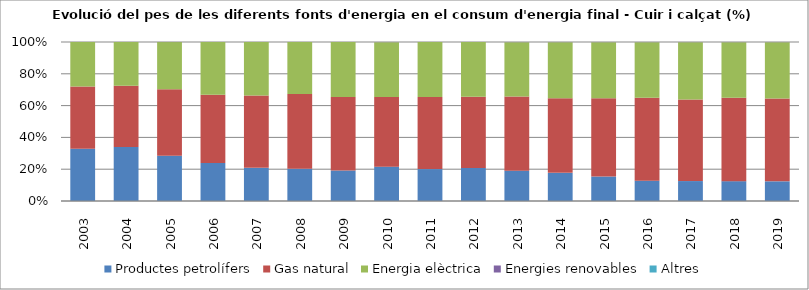
| Category | Productes petrolífers | Gas natural | Energia elèctrica | Energies renovables | Altres |
|---|---|---|---|---|---|
| 2003.0 | 8.65 | 10.31 | 7.36 | 0 | 0 |
| 2004.0 | 8.41 | 9.53 | 6.82 | 0 | 0 |
| 2005.0 | 5.79 | 8.53 | 6.06 | 0.01 | 0 |
| 2006.0 | 4.18 | 7.53 | 5.82 | 0 | 0 |
| 2007.0 | 2.98 | 6.51 | 4.81 | 0 | 0 |
| 2008.0 | 2.76 | 6.41 | 4.46 | 0 | 0 |
| 2009.0 | 2.1 | 5.05 | 3.79 | 0 | 0 |
| 2010.0 | 2.37 | 4.8 | 3.79 | 0.01 | 0 |
| 2011.0 | 2.17 | 4.9 | 3.75 | 0 | 0 |
| 2012.0 | 2.17 | 4.68 | 3.59 | 0 | 0 |
| 2013.0 | 1.9 | 4.64 | 3.4 | 0.01 | 0 |
| 2014.0 | 1.71 | 4.53 | 3.41 | 0.01 | 0 |
| 2015.0 | 1.53 | 4.89 | 3.51 | 0.01 | 0 |
| 2016.0 | 1.34 | 5.47 | 3.66 | 0.01 | 0 |
| 2017.0 | 1.27 | 5.2 | 3.65 | 0.01 | 0 |
| 2018.0 | 1.29 | 5.42 | 3.62 | 0.01 | 0 |
| 2019.0 | 1.28 | 5.38 | 3.67 | 0.01 | 0 |